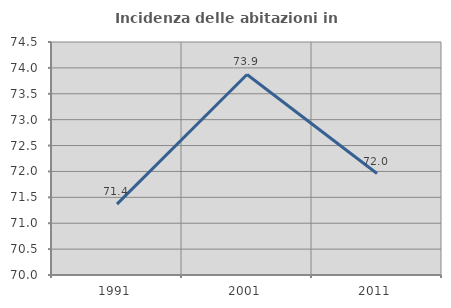
| Category | Incidenza delle abitazioni in proprietà  |
|---|---|
| 1991.0 | 71.368 |
| 2001.0 | 73.873 |
| 2011.0 | 71.96 |